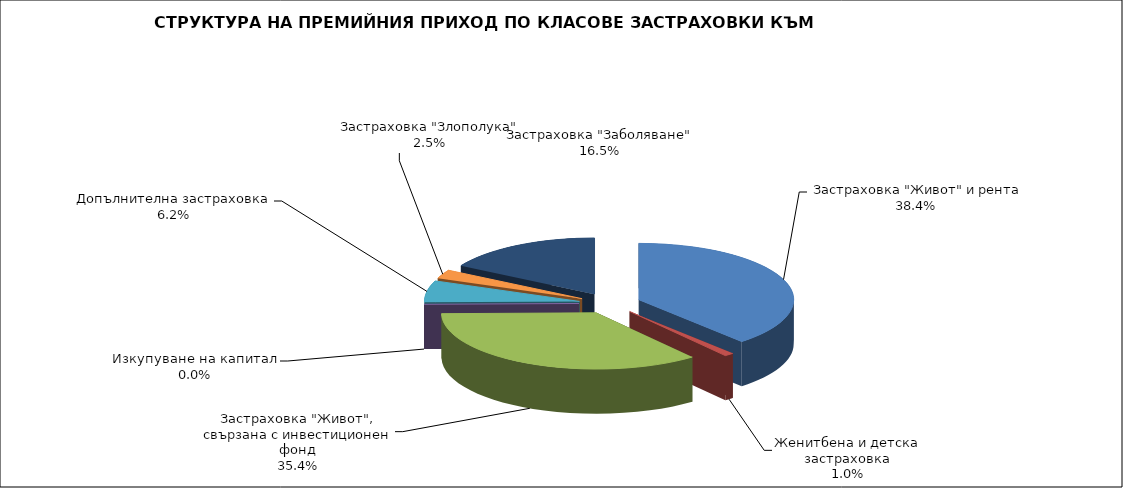
| Category |  Застраховка "Живот" и рента |
|---|---|
|  Застраховка "Живот" и рента | 240256029.75 |
| Женитбена и детска застраховка | 6186766.636 |
| Застраховка "Живот", свързана с инвестиционен фонд | 221133426.206 |
| Изкупуване на капитал | 0 |
| Допълнителна застраховка | 38686083.789 |
| Застраховка "Злополука" | 15693504.97 |
| Застраховка "Заболяване" | 103434310.2 |